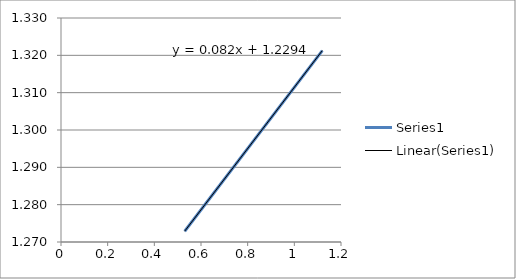
| Category | Series 0 |
|---|---|
| 0.53 | 1.273 |
| 1.12 | 1.321 |